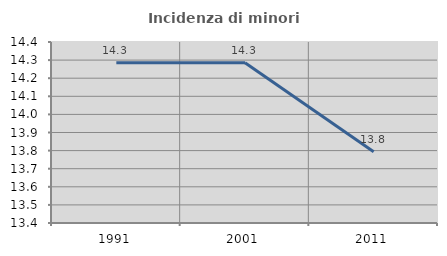
| Category | Incidenza di minori stranieri |
|---|---|
| 1991.0 | 14.286 |
| 2001.0 | 14.286 |
| 2011.0 | 13.793 |